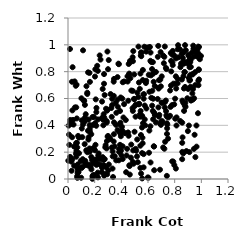
| Category | Series 0 |
|---|---|
| 0.797304120029426 | 0.921 |
| 0.562357184556947 | 0.416 |
| 0.10680305037132208 | 0.312 |
| 0.9210749633324836 | 0.835 |
| 0.9110553314862836 | 0.734 |
| 0.48899094206666055 | 0.213 |
| 0.292231240850581 | 0.283 |
| 0.6947383864375963 | 0.946 |
| 0.542647150077309 | 0.083 |
| 0.5552120279888694 | 0.384 |
| 0.5012308801654148 | 0.545 |
| 0.20232297530727178 | 0.764 |
| 0.7796913870292098 | 0.55 |
| 0.04175667667707427 | 0.406 |
| 0.6522087068755884 | 0.482 |
| 0.18581594822627015 | 0.402 |
| 0.04990359536149041 | 0.727 |
| 0.12496527432047042 | 0.26 |
| 0.8523837978286677 | 0.853 |
| 0.2723379696044072 | 0.456 |
| 0.08138933473945228 | 0.308 |
| 0.915738198230289 | 0.774 |
| 0.18407870867180115 | 0.462 |
| 0.06975780807988681 | 0.235 |
| 0.822844768852436 | 0.967 |
| 0.03783914964844198 | 0.44 |
| 0.2724436079722202 | 0.443 |
| 0.3286869476544123 | 0.235 |
| 0.5074196808023748 | 0.225 |
| 0.3452066169501058 | 0.422 |
| 0.8660786445725674 | 0.766 |
| 0.5507988313020094 | 0.943 |
| 0.2132866893592534 | 0.105 |
| 0.9770257955597358 | 0.929 |
| 0.3736721654983843 | 0.538 |
| 0.15332209954769954 | 0.099 |
| 0.959522285524678 | 0.95 |
| 0.9105750412460314 | 0.201 |
| 0.16311441660137105 | 0.203 |
| 0.6304751476399899 | 0.819 |
| 0.9225078808155771 | 0.584 |
| 0.016827779820845115 | 0.425 |
| 0.872804809920085 | 0.796 |
| 0.03272421377389287 | 0.511 |
| 0.40459552847335645 | 0.389 |
| 0.19645350370171416 | 0.222 |
| 0.93934130254535 | 0.994 |
| 0.631138142138714 | 0.547 |
| 0.44771538818155115 | 0.727 |
| 0.659343890614306 | 0.422 |
| 0.7223621296714514 | 0.911 |
| 0.20224215706489848 | 0.214 |
| 0.12741494213886012 | 0.457 |
| 0.1443889356698664 | 0.634 |
| 0.008023728772806542 | 0.331 |
| 0.22666194082235155 | 0.174 |
| 0.3281425669211869 | 0.463 |
| 0.6809794687354392 | 0.465 |
| 0.9660561663545146 | 0.915 |
| 0.3310503501570942 | 0.551 |
| 0.6848724084109689 | 0.478 |
| 0.8808588103777517 | 0.871 |
| 0.16113645419936 | 0.228 |
| 0.5972478004163653 | 0.011 |
| 0.43587601877007776 | 0.051 |
| 0.6393982162621628 | 0.786 |
| 0.8648941437922311 | 0.876 |
| 0.8032684712133998 | 0.599 |
| 0.9233217938147844 | 0.594 |
| 0.4719972542140556 | 0.159 |
| 0.6365499886286003 | 0.871 |
| 0.30268762180838643 | 0.064 |
| 0.702957025386663 | 0.765 |
| 0.7414386745604448 | 0.023 |
| 0.45045944991184106 | 0.347 |
| 0.15473699106804067 | 0.443 |
| 0.5545125304437247 | 0.472 |
| 0.49676690364538656 | 0.779 |
| 0.02602936098509044 | 0.13 |
| 0.045810744651686996 | 0.242 |
| 0.07406146694787234 | 0.109 |
| 0.918443603866554 | 0.891 |
| 0.10341630874351047 | 0.376 |
| 0.14461916418766874 | 0.2 |
| 0.3427914341111585 | 0.725 |
| 0.22628623821176183 | 0.151 |
| 0.8689484610541626 | 0.95 |
| 0.129187609163948 | 0.135 |
| 0.21180949395285975 | 0.397 |
| 0.8815725052715918 | 0.538 |
| 0.18838875355677628 | 0.119 |
| 0.6190518482586228 | 0.942 |
| 0.74276472355665 | 0.464 |
| 0.9803147501037893 | 0.813 |
| 0.30046426453416303 | 0.321 |
| 0.8394143871771651 | 0.966 |
| 0.519066964696049 | 0.295 |
| 0.5570427996413652 | 0.466 |
| 0.45458405404573626 | 0.322 |
| 0.540816347905991 | 0.464 |
| 0.25542111734223555 | 0.084 |
| 0.532416581095142 | 0.557 |
| 0.1829809473197042 | 0.001 |
| 0.5925604558414671 | 0.98 |
| 0.6224351350225935 | 0.772 |
| 0.3002076240817863 | 0.819 |
| 0.9531077058207814 | 0.796 |
| 0.3714735967905806 | 0.592 |
| 0.2906268035671282 | 0.421 |
| 0.06999816291292076 | 0.009 |
| 0.48494133896559266 | 0.908 |
| 0.4953388224582171 | 0.597 |
| 0.9338875728073217 | 0.78 |
| 0.823182205011867 | 0.745 |
| 0.7858391594595168 | 0.955 |
| 0.3932845069431305 | 0.419 |
| 0.1885405665417277 | 0.029 |
| 0.7354584692676264 | 0.506 |
| 0.060648302424327206 | 0.267 |
| 0.05935084553625411 | 0.189 |
| 0.20801742205660126 | 0.593 |
| 0.9641509602545535 | 0.241 |
| 0.16401753478787567 | 0.355 |
| 0.38127063412288903 | 0.139 |
| 0.8779642598553911 | 0.686 |
| 0.6592409482618403 | 0.798 |
| 0.6510733542427533 | 0.693 |
| 0.9772159047963628 | 0.937 |
| 0.22308847171384444 | 0.047 |
| 0.3352350416149271 | 0.169 |
| 0.33404323952458853 | 0.078 |
| 0.6109073474286287 | 0.65 |
| 0.17469925392602603 | 0.164 |
| 0.9362532482798492 | 0.592 |
| 0.14979038493730507 | 0.359 |
| 0.8704195854369463 | 0.507 |
| 0.3714854138865541 | 0.364 |
| 0.5320488843358153 | 0.719 |
| 0.5285368006332622 | 0.987 |
| 0.5429685772948672 | 0.786 |
| 0.4461229282433632 | 0.765 |
| 0.6057184862246477 | 0.776 |
| 0.49893564743686153 | 0.352 |
| 0.5756301413712744 | 0.548 |
| 0.3194495722353461 | 0.633 |
| 0.42740918105962417 | 0.342 |
| 0.6768639330235154 | 0.992 |
| 0.24380000151550588 | 0.89 |
| 0.12914594599068477 | 0.119 |
| 0.33792508235655505 | 0.015 |
| 0.38596678095672393 | 0.348 |
| 0.253836042151163 | 0.052 |
| 0.13267657503783495 | 0.104 |
| 0.4518898915470631 | 0.583 |
| 0.22114015152068747 | 0.116 |
| 0.7651106759378616 | 0.471 |
| 0.5612880709283763 | 0.737 |
| 0.1611042446127098 | 0.791 |
| 0.6246364032343473 | 0.872 |
| 0.9050246665511441 | 0.855 |
| 0.06249928223592213 | 0.166 |
| 0.937106419909245 | 0.67 |
| 0.383286720690006 | 0.224 |
| 0.7254555668151528 | 0.534 |
| 0.1645117977730222 | 0.724 |
| 0.22456280396033998 | 0.012 |
| 0.4918810724181605 | 0.114 |
| 0.8700690163563919 | 0.86 |
| 0.07869547255718602 | 0.052 |
| 0.9025565244836848 | 0.926 |
| 0.8758902112229859 | 0.548 |
| 0.672815250314741 | 0.597 |
| 0.20485585301376597 | 0.818 |
| 0.03066823520872056 | 0.311 |
| 0.7412310452449627 | 0.415 |
| 0.7340810836164112 | 0.828 |
| 0.22420149753346835 | 0.444 |
| 0.8642706307981797 | 0.191 |
| 0.5727656096740676 | 0.986 |
| 0.4060669496229927 | 0.363 |
| 0.548166236618717 | 0.041 |
| 0.843203091889591 | 0.834 |
| 0.0985648237568677 | 0.009 |
| 0.9148321583627567 | 0.899 |
| 0.8142345100601678 | 0.459 |
| 0.35790775621868903 | 0.568 |
| 0.206093821050002 | 0.255 |
| 0.2703172557518572 | 0.71 |
| 0.7854835093818759 | 0.849 |
| 0.6362372079455503 | 0.507 |
| 0.06598986091912942 | 0.451 |
| 0.293669849148191 | 0.035 |
| 0.41004996959531925 | 0.149 |
| 0.01002077850910882 | 0.254 |
| 0.34955952480190017 | 0.243 |
| 0.46338172848672915 | 0.033 |
| 0.2673401428943209 | 0.104 |
| 0.887785024172174 | 0.208 |
| 0.8953831186326812 | 0.602 |
| 0.9821109829758429 | 0.903 |
| 0.5584376379235363 | 0.308 |
| 0.09608875139694209 | 0.135 |
| 0.7831354166499754 | 0.869 |
| 0.32496604840340954 | 0.529 |
| 0.017226216489252624 | 0.44 |
| 0.10836802645494534 | 0.138 |
| 0.6988554466734901 | 0.428 |
| 0.19770909527727956 | 0.029 |
| 0.85301083655209 | 0.932 |
| 0.5674175522882482 | 0.186 |
| 0.07410152361330873 | 0.08 |
| 0.7227638557844707 | 0.226 |
| 0.48961223081202243 | 0.953 |
| 0.29653284590621415 | 0.517 |
| 0.5675414381891379 | 0.599 |
| 0.8274457523588163 | 0.907 |
| 0.10383125332734139 | 0.437 |
| 0.7338818125610419 | 0.585 |
| 0.2822486413419465 | 0.252 |
| 0.1383652677384979 | 0.692 |
| 0.06845245010346844 | 0.021 |
| 0.46558148122611354 | 0.88 |
| 0.41576375170287677 | 0.458 |
| 0.3784546753050079 | 0.86 |
| 0.8090924068461901 | 0.078 |
| 0.9840513265480847 | 0.912 |
| 0.34517726643714747 | 0.746 |
| 0.603521667022918 | 0.01 |
| 0.781418892971908 | 0.131 |
| 0.27476819642170086 | 0.626 |
| 0.6452212492844311 | 0.243 |
| 0.0022453272982009033 | 0.136 |
| 0.4864344085084499 | 0.128 |
| 0.7658096756290557 | 0.66 |
| 0.5235235113742388 | 0.125 |
| 0.4749817695632405 | 0.659 |
| 0.11010126634993554 | 0.091 |
| 0.06415876302788492 | 0.703 |
| 0.9050520588248738 | 0.918 |
| 0.9324910053666117 | 0.638 |
| 0.2133686257052494 | 0.53 |
| 0.6737084610712148 | 0.911 |
| 0.2615726482339896 | 0.443 |
| 0.5671239560994262 | 0.087 |
| 0.1810660277488201 | 0.141 |
| 0.11215845829499524 | 0.406 |
| 0.4014986894451708 | 0.176 |
| 0.2412715714463095 | 0.107 |
| 0.03439510009841737 | 0.833 |
| 0.1755055344822647 | 0.072 |
| 0.8575446890679195 | 0.584 |
| 0.23985168855966224 | 0.149 |
| 0.6426607134174304 | 0.724 |
| 0.45988779002494656 | 0.102 |
| 0.8799264748782678 | 0.568 |
| 0.26916667587104687 | 0.144 |
| 0.4591966894752576 | 0.786 |
| 0.857182499162693 | 0.202 |
| 0.7734085598031991 | 0.88 |
| 0.5652728024066601 | 0.629 |
| 0.8694342227649041 | 0.675 |
| 0.9825818915672876 | 0.742 |
| 0.6513725492405789 | 0.477 |
| 0.295738558599487 | 0.95 |
| 0.26020869760470455 | 0.163 |
| 0.5796788552624791 | 0.4 |
| 0.4582153987161802 | 0.778 |
| 0.38142065952664705 | 0.856 |
| 0.5200496166068674 | 0.643 |
| 0.8477210650049647 | 0.86 |
| 0.5882600367158707 | 0.526 |
| 0.6971103597099408 | 0.403 |
| 0.407214119637355 | 0.599 |
| 0.8039897851006478 | 0.449 |
| 0.9807452674552787 | 0.817 |
| 0.38379778552751426 | 0.201 |
| 0.5614805224067287 | 0.813 |
| 0.8836726423037224 | 0.96 |
| 0.9447524073055915 | 0.225 |
| 0.8644978518637901 | 0.568 |
| 0.07576121161950675 | 0.321 |
| 0.2603331779744485 | 0.146 |
| 0.7538686459995365 | 0.459 |
| 0.8094906222755434 | 0.899 |
| 0.43330961252376127 | 0.44 |
| 0.4431646850943232 | 0.225 |
| 0.39472319933808764 | 0.608 |
| 0.618096083391179 | 0.881 |
| 0.2602046042790533 | 0.671 |
| 0.2895184351533712 | 0.228 |
| 0.07310537785946165 | 0.072 |
| 0.05828456534873092 | 0.695 |
| 0.9068467683924778 | 0.753 |
| 0.3956129694781057 | 0.336 |
| 0.0516951853102892 | 0.533 |
| 0.5756874430026223 | 0.444 |
| 0.6180661632846933 | 0.393 |
| 0.004809480179992467 | 0.398 |
| 0.9825613853273992 | 0.984 |
| 0.15684512268392706 | 0.107 |
| 0.5446679513971208 | 0.507 |
| 0.790492964055465 | 0.711 |
| 0.3054453251772024 | 0.886 |
| 0.5554888625045465 | 0.193 |
| 0.02686627554059232 | 0.061 |
| 0.7066479047382231 | 0.569 |
| 0.9151003660005707 | 0.738 |
| 0.9457435785732388 | 0.602 |
| 0.90095803491139 | 0.671 |
| 0.9067710662359609 | 0.398 |
| 0.528862186058034 | 0.558 |
| 0.3626815460336315 | 0.493 |
| 0.5866720743469122 | 0.732 |
| 0.39657103228836854 | 0.319 |
| 0.014730724771870797 | 0.969 |
| 0.029920722607236227 | 0.725 |
| 0.48696318953746487 | 0.878 |
| 0.7284497106145716 | 0.277 |
| 0.9199815790702903 | 0.89 |
| 0.30613459372560664 | 0.108 |
| 0.0669780876922208 | 0.269 |
| 0.7263412560391058 | 0.572 |
| 0.6076121965987406 | 0.196 |
| 0.06201714419842743 | 0.534 |
| 0.10064061084578058 | 0.602 |
| 0.7050010169363431 | 0.422 |
| 0.0766252179057523 | 0.053 |
| 0.8592773684940184 | 0.311 |
| 0.6247312873540295 | 0.605 |
| 0.6822901701502448 | 0.737 |
| 0.8257055690172047 | 0.997 |
| 0.9633764689223475 | 0.399 |
| 0.13705828105226775 | 0.214 |
| 0.14477100718266808 | 0.643 |
| 0.28579359313208597 | 0.087 |
| 0.3130297786562835 | 0.306 |
| 0.6899467826698211 | 0.069 |
| 0.9539044764418823 | 0.7 |
| 0.9297175533848173 | 0.942 |
| 0.397381141640462 | 0.212 |
| 0.619306198417967 | 0.123 |
| 0.2651237000391106 | 0.4 |
| 0.06331651306339428 | 0.209 |
| 0.7964426893282355 | 0.556 |
| 0.22978981004316248 | 0.19 |
| 0.743442544627824 | 0.378 |
| 0.8760143716886184 | 0.797 |
| 0.46234573667447093 | 0.097 |
| 0.8562790481345838 | 0.148 |
| 0.19042172374567648 | 0.231 |
| 0.12475027504628891 | 0.428 |
| 0.35951321038766704 | 0.404 |
| 0.42068747166704823 | 0.558 |
| 0.27546209463214005 | 0.148 |
| 0.5494695950315683 | 0.915 |
| 0.48581099935149097 | 0.657 |
| 0.21625445125874593 | 0.111 |
| 0.7139729454529784 | 0.235 |
| 0.3432241163834253 | 0.62 |
| 0.19382821100100156 | 0.462 |
| 0.4552235073574578 | 0.857 |
| 0.9784545831754908 | 0.699 |
| 0.6464367453308284 | 0.065 |
| 0.032435237734660075 | 0.149 |
| 0.677905402750759 | 0.534 |
| 0.8567298283045552 | 0.42 |
| 0.16998374227502902 | 0.091 |
| 0.6102185368032516 | 0.361 |
| 0.3504658569854561 | 0.17 |
| 0.49676613900140887 | 0.595 |
| 0.6798972998590397 | 0.679 |
| 0.9968988769972482 | 0.917 |
| 0.3870013244021764 | 0.407 |
| 0.29712299850714974 | 0.316 |
| 0.7260661426685774 | 0.987 |
| 0.15042039426362816 | 0.795 |
| 0.5384596136964156 | 0.481 |
| 0.9747916835115862 | 0.49 |
| 0.7689942963353654 | 0.537 |
| 0.3347029078208359 | 0.205 |
| 0.917203889078772 | 0.872 |
| 0.467721457080699 | 0.751 |
| 0.27035746845487907 | 0.782 |
| 0.7424563624404802 | 0.336 |
| 0.2553658385855573 | 0.577 |
| 0.5695583119963499 | 0.632 |
| 0.771076913698367 | 0.939 |
| 0.21910179362404075 | 0.844 |
| 0.9057513528263446 | 0.88 |
| 0.9767790280379692 | 0.987 |
| 0.7743268950842448 | 0.802 |
| 0.22387142021862252 | 0.806 |
| 0.23767545307786073 | 0.921 |
| 0.9348922897027911 | 0.78 |
| 0.6460622941644426 | 0.495 |
| 0.5842662489798098 | 0.716 |
| 0.6919693569353385 | 0.74 |
| 0.10116966542848344 | 0.082 |
| 0.21262757020652331 | 0.498 |
| 0.48633450989087246 | 0.508 |
| 0.7190362819838224 | 0.863 |
| 0.9421776042672716 | 0.912 |
| 0.31595131355604333 | 0.297 |
| 0.9775082314541079 | 0.732 |
| 0.48414181989500454 | 0.528 |
| 0.5479995844867132 | 0.942 |
| 0.5115442619289495 | 0.211 |
| 0.7024560405918445 | 0.568 |
| 0.5097805970019827 | 0.555 |
| 0.7450069630964918 | 0.406 |
| 0.16248669432945304 | 0.402 |
| 0.7503567605256987 | 0.301 |
| 0.2830791694619875 | 0.037 |
| 0.28519696175470305 | 0.524 |
| 0.5385193362197296 | 0.672 |
| 0.8113984964656171 | 0.674 |
| 0.41071914085660216 | 0.721 |
| 0.6141924025199114 | 0.984 |
| 0.9116224893443969 | 0.833 |
| 0.8991625504133357 | 0.357 |
| 0.8057019267391398 | 0.71 |
| 0.015661915755941974 | 0.165 |
| 0.6385026655596802 | 0.445 |
| 0.5272431736075213 | 0.611 |
| 0.34421798561215405 | 0.334 |
| 0.18362760949765966 | 0.021 |
| 0.15313383570546582 | 0.293 |
| 0.5598913405731432 | 0.266 |
| 0.8609393445567936 | 0.902 |
| 0.8137282137763063 | 0.399 |
| 0.6070206935943088 | 0.98 |
| 0.20607146033773108 | 0.142 |
| 0.8414749345524128 | 0.432 |
| 0.29025393959805806 | 0.432 |
| 0.7380280325528474 | 0.819 |
| 0.37149336084959533 | 0.759 |
| 0.7974506682067312 | 0.103 |
| 0.29241995835013396 | 0.509 |
| 0.34265281128710257 | 0.28 |
| 0.39011024347265294 | 0.255 |
| 0.8777436865434023 | 0.998 |
| 0.7898541810798125 | 0.129 |
| 0.7722232461864666 | 0.696 |
| 0.5425761005861899 | 0.248 |
| 0.04627374476935412 | 0.099 |
| 0.7063876377240527 | 0.431 |
| 0.8541766694042916 | 0.742 |
| 0.2552027712553556 | 0.456 |
| 0.27959808542192954 | 0.237 |
| 0.08259889034940095 | 0.192 |
| 0.19608152867063164 | 0.144 |
| 0.5345278511078847 | 0.561 |
| 0.0718846000526459 | 0.045 |
| 0.5470415237319559 | 0.328 |
| 0.9411754766869815 | 0.971 |
| 0.36135053411920337 | 0.139 |
| 0.8222868577643778 | 0.713 |
| 0.5066670601417708 | 0.465 |
| 0.4744401138850245 | 0.257 |
| 0.7376615250901122 | 0.474 |
| 0.9182837378891604 | 0.687 |
| 0.12162286062001304 | 0.582 |
| 0.13298646174309464 | 0.483 |
| 0.267556850640766 | 0.483 |
| 0.11275891338012904 | 0.959 |
| 0.3311985178689576 | 0.597 |
| 0.9711901253785186 | 0.967 |
| 0.6388332280423312 | 0.598 |
| 0.6794441233843596 | 0.674 |
| 0.16301379789801654 | 0.373 |
| 0.15449477338634737 | 0.311 |
| 0.46409077112375724 | 0.869 |
| 0.5462041460638986 | 0.921 |
| 0.9889556700665192 | 0.893 |
| 0.6919381977309248 | 0.412 |
| 0.7139344430014956 | 0.92 |
| 0.11043020945263346 | 0.148 |
| 0.6321346026048353 | 0.658 |
| 0.40993756799125786 | 0.244 |
| 0.8086763517272694 | 0.765 |
| 0.1745721798283946 | 0.334 |
| 0.2029678548489935 | 0.416 |
| 0.5173963668490128 | 0.169 |
| 0.11870409010896339 | 0.584 |
| 0.696318610579544 | 0.691 |
| 0.6432320884267461 | 0.243 |
| 0.783442085726307 | 0.926 |
| 0.5861662409248689 | 0.949 |
| 0.39018518610185277 | 0.507 |
| 0.5562254789042881 | 0.004 |
| 0.8565719197163875 | 0.27 |
| 0.43923968506000294 | 0.175 |
| 0.8634291659700921 | 0.941 |
| 0.1269591536728831 | 0.552 |
| 0.2707932325231331 | 0.025 |
| 0.9553391238210023 | 0.163 |
| 0.4205014791503321 | 0.727 |
| 0.9494315298170858 | 0.33 |
| 0.9606594686665789 | 0.94 |
| 0.029016260346457073 | 0.41 |